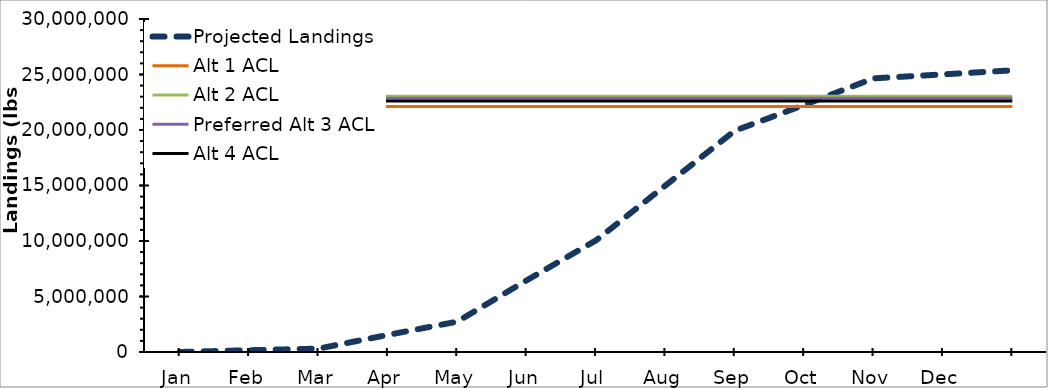
| Category | Projected Landings | Alt 1 ACL | Alt 2 ACL | Preferred Alt 3 ACL | Alt 4 ACL |
|---|---|---|---|---|---|
| Jan | 0 | 22113688 | 23035091 | 22850811 | 22605103 |
| Feb | 159713.576 | 22113688 | 23035091 | 22850811 | 22605103 |
| Mar | 303971 | 22113688 | 23035091 | 22850811 | 22605103 |
| Apr | 1539358.607 | 22113688 | 23035091 | 22850811 | 22605103 |
| May | 2734895 | 22113688 | 23035091 | 22850811 | 22605103 |
| Jun | 6455157.738 | 22113688 | 23035091 | 22850811 | 22605103 |
| Jul | 10055412 | 22113688 | 23035091 | 22850811 | 22605103 |
| Aug | 14995843 | 22113688 | 23035091 | 22850811 | 22605103 |
| Sep | 19936274 | 22113688 | 23035091 | 22850811 | 22605103 |
| Oct | 22256129.246 | 22113688 | 23035091 | 22850811 | 22605103 |
| Nov | 24653313 | 22113688 | 23035091 | 22850811 | 22605103 |
| Dec | 25008723.492 | 22113688 | 23035091 | 22850811 | 22605103 |